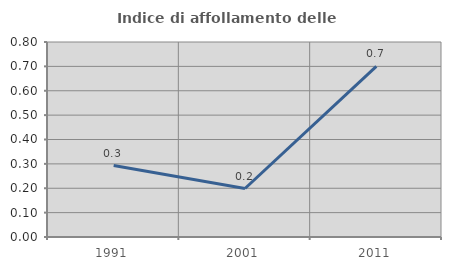
| Category | Indice di affollamento delle abitazioni  |
|---|---|
| 1991.0 | 0.293 |
| 2001.0 | 0.199 |
| 2011.0 | 0.7 |